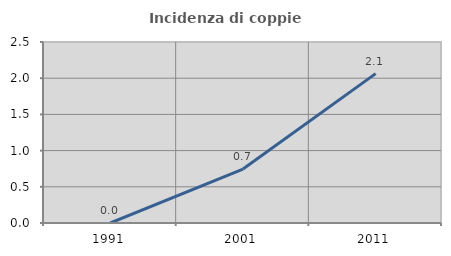
| Category | Incidenza di coppie miste |
|---|---|
| 1991.0 | 0 |
| 2001.0 | 0.745 |
| 2011.0 | 2.063 |